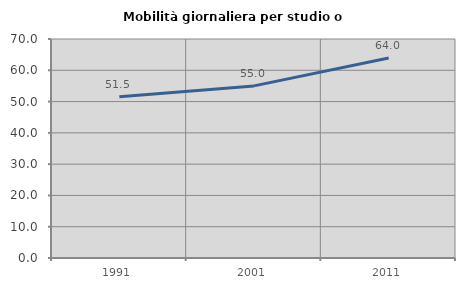
| Category | Mobilità giornaliera per studio o lavoro |
|---|---|
| 1991.0 | 51.515 |
| 2001.0 | 55.01 |
| 2011.0 | 63.956 |